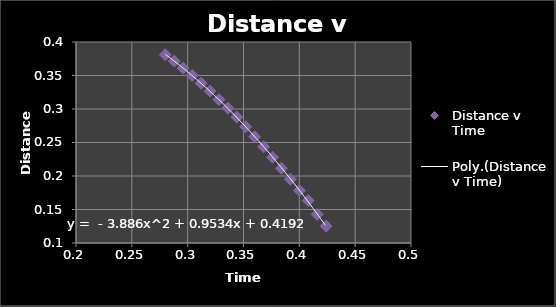
| Category | Distance v Time |
|---|---|
| 0.28 | 0.381 |
| 0.288 | 0.372 |
| 0.296 | 0.361 |
| 0.304 | 0.35 |
| 0.312 | 0.338 |
| 0.32 | 0.327 |
| 0.328 | 0.314 |
| 0.336 | 0.301 |
| 0.344 | 0.288 |
| 0.352 | 0.273 |
| 0.36 | 0.258 |
| 0.368 | 0.244 |
| 0.376 | 0.228 |
| 0.384 | 0.212 |
| 0.392 | 0.195 |
| 0.4 | 0.178 |
| 0.408 | 0.163 |
| 0.416 | 0.143 |
| 0.424 | 0.125 |